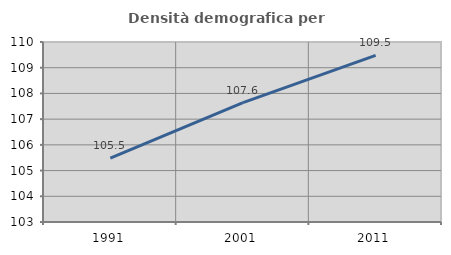
| Category | Densità demografica |
|---|---|
| 1991.0 | 105.488 |
| 2001.0 | 107.641 |
| 2011.0 | 109.48 |